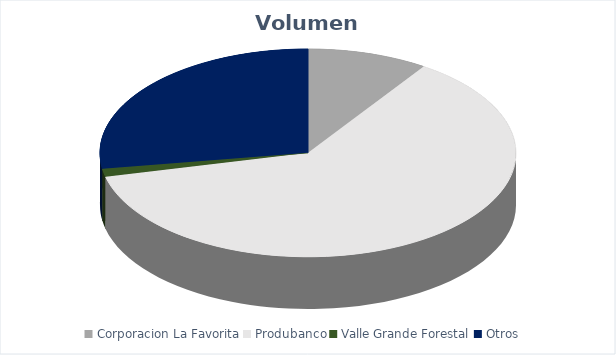
| Category | VOLUMEN ($USD) |
|---|---|
| Corporacion La Favorita | 15200 |
| Produbanco | 100404.5 |
| Valle Grande Forestal | 2002 |
| Otros | 44512.7 |